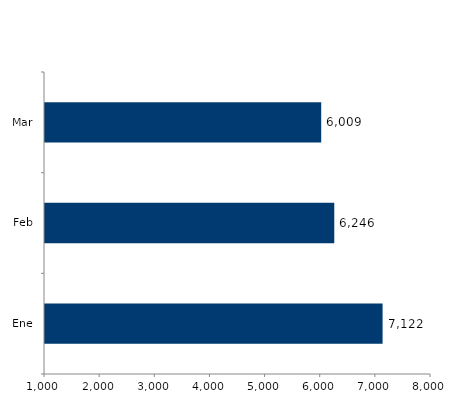
| Category | Series 0 |
|---|---|
| Ene | 7122 |
| Feb | 6246 |
| Mar | 6009 |